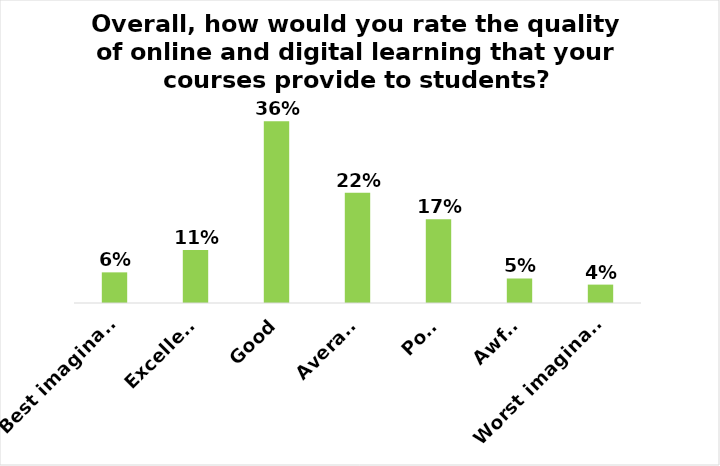
| Category | Overall, how would you rate the quality of online and digital learning that your courses provide to students? |
|---|---|
| Best imaginable | 0.061 |
| Excellent | 0.106 |
| Good | 0.362 |
| Average | 0.22 |
| Poor | 0.167 |
| Awful | 0.049 |
| Worst imaginable | 0.037 |